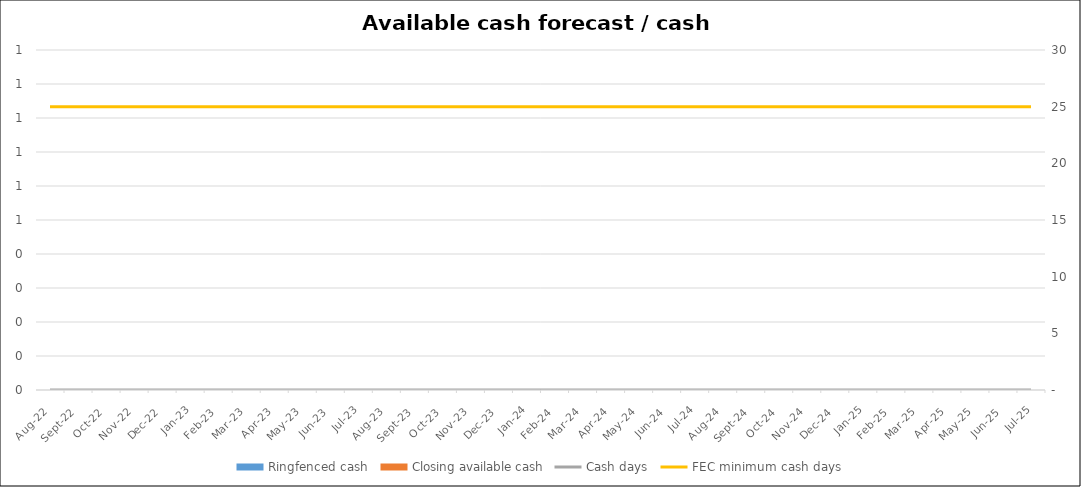
| Category | Ringfenced cash  | Closing available cash |
|---|---|---|
| 2022-08-31 |  | 0 |
| 2022-09-30 |  | 0 |
| 2022-10-31 |  | 0 |
| 2022-11-30 |  | 0 |
| 2022-12-31 |  | 0 |
| 2023-01-31 |  | 0 |
| 2023-02-28 |  | 0 |
| 2023-03-31 |  | 0 |
| 2023-04-30 |  | 0 |
| 2023-05-31 |  | 0 |
| 2023-06-30 |  | 0 |
| 2023-07-31 |  | 0 |
| 2023-08-31 |  | 0 |
| 2023-09-30 |  | 0 |
| 2023-10-31 |  | 0 |
| 2023-11-30 |  | 0 |
| 2023-12-31 |  | 0 |
| 2024-01-31 |  | 0 |
| 2024-02-29 |  | 0 |
| 2024-03-31 |  | 0 |
| 2024-04-30 |  | 0 |
| 2024-05-31 |  | 0 |
| 2024-06-30 |  | 0 |
| 2024-07-31 |  | 0 |
| 2024-08-31 |  | 0 |
| 2024-09-30 |  | 0 |
| 2024-10-31 |  | 0 |
| 2024-11-30 |  | 0 |
| 2024-12-31 |  | 0 |
| 2025-01-31 |  | 0 |
| 2025-02-28 |  | 0 |
| 2025-03-31 |  | 0 |
| 2025-04-30 |  | 0 |
| 2025-05-31 |  | 0 |
| 2025-06-30 |  | 0 |
| 2025-07-31 |  | 0 |